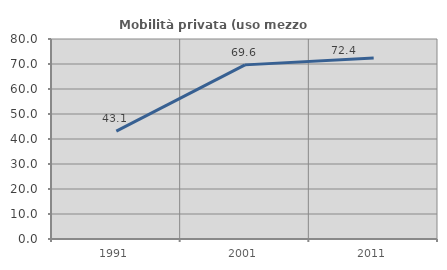
| Category | Mobilità privata (uso mezzo privato) |
|---|---|
| 1991.0 | 43.127 |
| 2001.0 | 69.649 |
| 2011.0 | 72.441 |